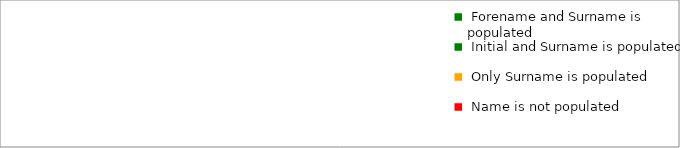
| Category | Series 0 |
|---|---|
|  Forename and Surname is populated  | 0 |
|  Initial and Surname is populated  | 0 |
|  Only Surname is populated  | 0 |
|  Name is not populated  | 0 |